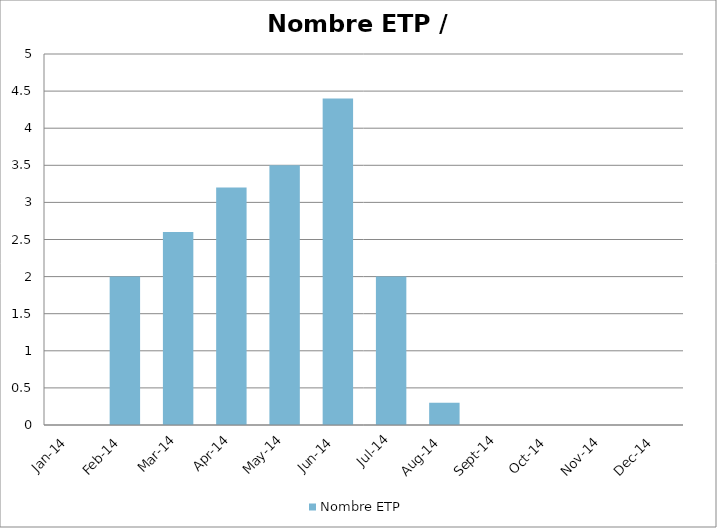
| Category | Nombre ETP |
|---|---|
| 2014-01-01 | 0 |
| 2014-02-01 | 2 |
| 2014-03-01 | 2.6 |
| 2014-04-01 | 3.2 |
| 2014-05-01 | 3.5 |
| 2014-06-01 | 4.4 |
| 2014-07-01 | 2 |
| 2014-08-01 | 0.3 |
| 2014-09-01 | 0 |
| 2014-10-01 | 0 |
| 2014-11-01 | 0 |
| 2014-12-01 | 0 |